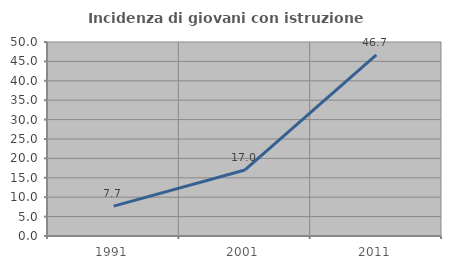
| Category | Incidenza di giovani con istruzione universitaria |
|---|---|
| 1991.0 | 7.692 |
| 2001.0 | 17.021 |
| 2011.0 | 46.667 |